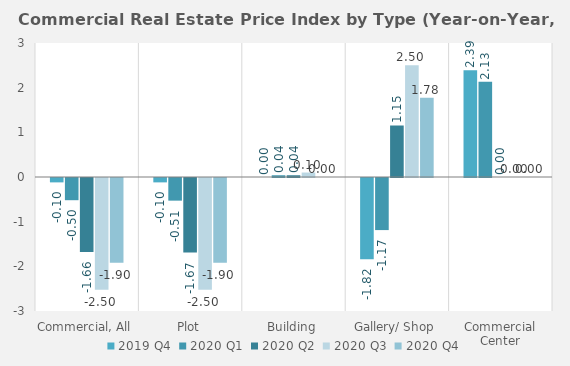
| Category | 2019 | 2020 |
|---|---|---|
| Commercial, All | -0.098 | -1.9 |
| Plot | -0.098 | -1.9 |
| Building | 0 | 0 |
| Gallery/ Shop | -1.818 | 1.777 |
| Commercial Center | 2.389 | 0 |